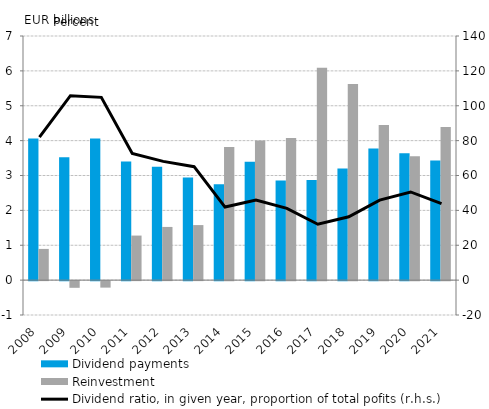
| Category | Dividend payments | Reinvestment |
|---|---|---|
| 2008.0 | 4.064 | 0.895 |
| 2009.0 | 3.522 | -0.192 |
| 2010.0 | 4.061 | -0.186 |
| 2011.0 | 3.399 | 1.278 |
| 2012.0 | 3.253 | 1.525 |
| 2013.0 | 2.94 | 1.578 |
| 2014.0 | 2.751 | 3.816 |
| 2015.0 | 3.396 | 4.002 |
| 2016.0 | 2.853 | 4.073 |
| 2017.0 | 2.872 | 6.088 |
| 2018.0 | 3.204 | 5.621 |
| 2019.0 | 3.777 | 4.452 |
| 2020.0 | 3.637 | 3.555 |
| 2021.0 | 3.429 | 4.393 |